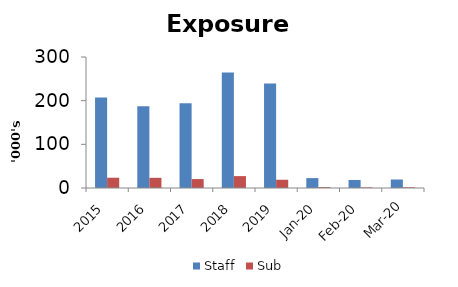
| Category | Staff | Sub |
|---|---|---|
| 2015 | 207536 | 23530 |
| 2016 | 187194 | 23350 |
| 2017 | 193983 | 20442 |
| 2018 | 264467 | 27213 |
| 2019 | 239228.46 | 18857.14 |
| Jan-20 | 22658 | 1910.7 |
| Feb-20 | 18444 | 1358.6 |
| Mar-20 | 19453 | 1609 |